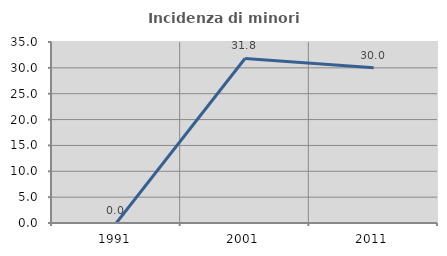
| Category | Incidenza di minori stranieri |
|---|---|
| 1991.0 | 0 |
| 2001.0 | 31.818 |
| 2011.0 | 30 |